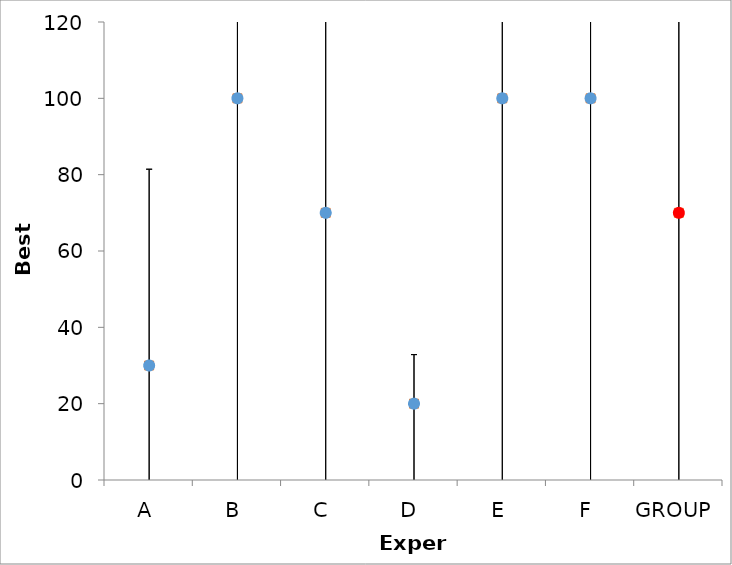
| Category | Series 1 | Series 0 |
|---|---|---|
| A | 30 | 30 |
| B | 100 | 100 |
| C | 70 | 70 |
| D | 20 | 20 |
| E | 100 | 100 |
| F | 100 | 100 |
| GROUP | 70 | 70 |